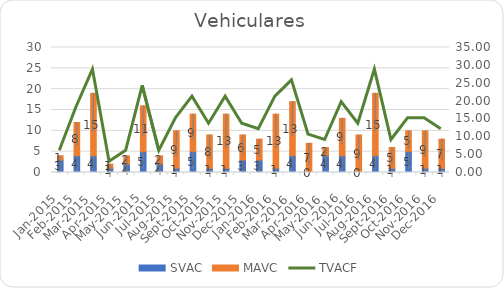
| Category | SVAC | MAVC |
|---|---|---|
| 2015-01-01 | 3 | 1 |
| 2015-02-01 | 4 | 8 |
| 2015-03-01 | 4 | 15 |
| 2015-04-01 | 1 | 1 |
| 2015-05-01 | 2 | 2 |
| 2015-06-01 | 5 | 11 |
| 2015-07-01 | 2 | 2 |
| 2015-08-01 | 1 | 9 |
| 2015-09-01 | 5 | 9 |
| 2015-10-01 | 1 | 8 |
| 2015-11-01 | 1 | 13 |
| 2015-12-01 | 3 | 6 |
| 2016-01-01 | 3 | 5 |
| 2016-02-01 | 1 | 13 |
| 2016-03-01 | 4 | 13 |
| 2016-04-01 | 0 | 7 |
| 2016-05-01 | 4 | 2 |
| 2016-06-01 | 4 | 9 |
| 2016-07-01 | 0 | 9 |
| 2016-08-01 | 4 | 15 |
| 2016-09-01 | 1 | 5 |
| 2016-10-01 | 5 | 5 |
| 2016-11-01 | 1 | 9 |
| 2016-12-01 | 1 | 7 |